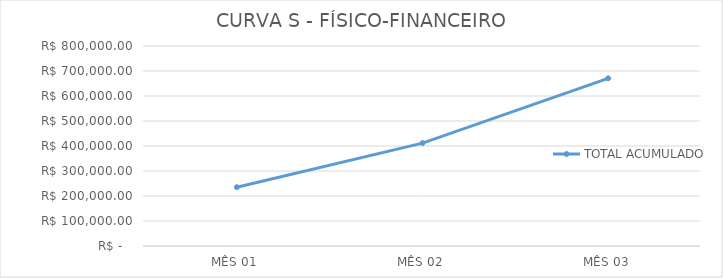
| Category | TOTAL ACUMULADO |
|---|---|
|  MÊS 01  | 235184.612 |
|  MÊS 02  | 411573.071 |
|  MÊS 03  | 670764.63 |